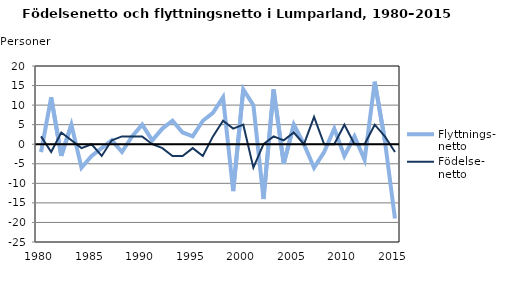
| Category | Flyttnings- netto | Födelse- netto |
|---|---|---|
| 1980.0 | -2 | 2 |
| 1981.0 | 12 | -2 |
| 1982.0 | -3 | 3 |
| 1983.0 | 5 | 1 |
| 1984.0 | -6 | -1 |
| 1985.0 | -3 | 0 |
| 1986.0 | -1 | -3 |
| 1987.0 | 1 | 1 |
| 1988.0 | -2 | 2 |
| 1989.0 | 2 | 2 |
| 1990.0 | 5 | 2 |
| 1991.0 | 1 | 0 |
| 1992.0 | 4 | -1 |
| 1993.0 | 6 | -3 |
| 1994.0 | 3 | -3 |
| 1995.0 | 2 | -1 |
| 1996.0 | 6 | -3 |
| 1997.0 | 8 | 2 |
| 1998.0 | 12 | 6 |
| 1999.0 | -12 | 4 |
| 2000.0 | 14 | 5 |
| 2001.0 | 10 | -6 |
| 2002.0 | -14 | 0 |
| 2003.0 | 14 | 2 |
| 2004.0 | -5 | 1 |
| 2005.0 | 5 | 3 |
| 2006.0 | 0 | 0 |
| 2007.0 | -6 | 7 |
| 2008.0 | -2 | 0 |
| 2009.0 | 4 | 0 |
| 2010.0 | -3 | 5 |
| 2011.0 | 2 | 0 |
| 2012.0 | -4 | 0 |
| 2013.0 | 16 | 5 |
| 2014.0 | 1 | 2 |
| 2015.0 | -19 | -2 |